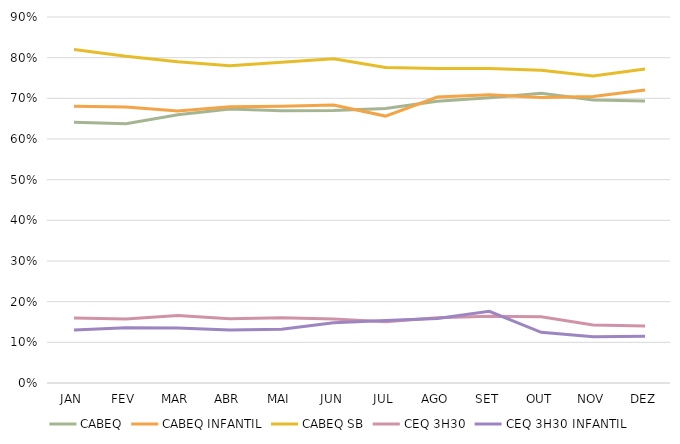
| Category | CABEQ | CABEQ INFANTIL | CABEQ SB | CEQ 3H30 | CEQ 3H30 INFANTIL |
|---|---|---|---|---|---|
| JAN | 0.641 | 0.68 | 0.82 | 0.16 | 0.13 |
| FEV | 0.638 | 0.679 | 0.803 | 0.157 | 0.136 |
| MAR | 0.66 | 0.669 | 0.79 | 0.166 | 0.135 |
| ABR | 0.674 | 0.68 | 0.78 | 0.158 | 0.131 |
| MAI | 0.669 | 0.68 | 0.789 | 0.16 | 0.132 |
| JUN | 0.67 | 0.683 | 0.797 | 0.157 | 0.148 |
| JUL | 0.675 | 0.656 | 0.776 | 0.151 | 0.154 |
| AGO | 0.693 | 0.703 | 0.773 | 0.16 | 0.159 |
| SET | 0.702 | 0.709 | 0.773 | 0.164 | 0.176 |
| OUT | 0.712 | 0.702 | 0.769 | 0.163 | 0.125 |
| NOV | 0.696 | 0.705 | 0.755 | 0.143 | 0.114 |
| DEZ | 0.693 | 0.72 | 0.772 | 0.14 | 0.115 |